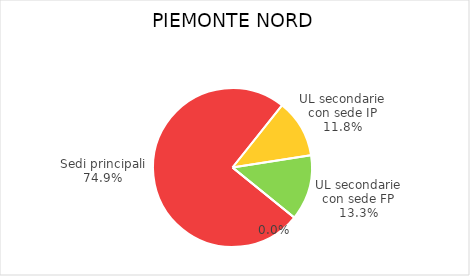
| Category | Piemonte Nord |
|---|---|
| Sedi principali | 40562 |
| UL secondarie con sede IP | 6407 |
| UL secondarie con sede FP | 7214 |